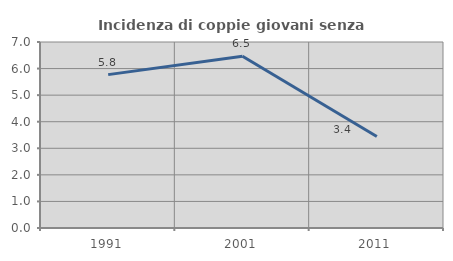
| Category | Incidenza di coppie giovani senza figli |
|---|---|
| 1991.0 | 5.772 |
| 2001.0 | 6.461 |
| 2011.0 | 3.444 |